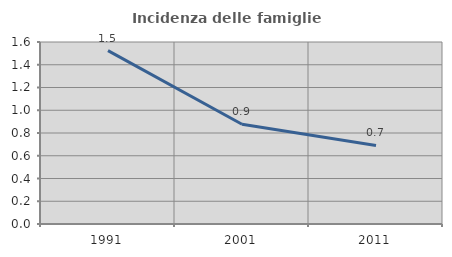
| Category | Incidenza delle famiglie numerose |
|---|---|
| 1991.0 | 1.524 |
| 2001.0 | 0.877 |
| 2011.0 | 0.691 |